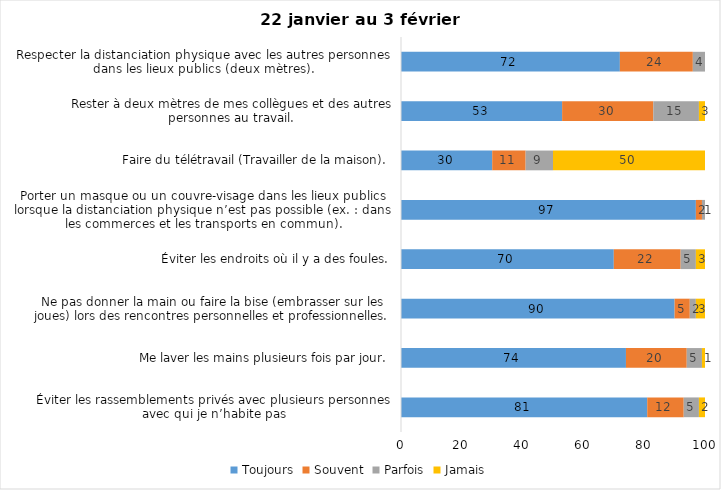
| Category | Toujours | Souvent | Parfois | Jamais |
|---|---|---|---|---|
| Éviter les rassemblements privés avec plusieurs personnes avec qui je n’habite pas | 81 | 12 | 5 | 2 |
| Me laver les mains plusieurs fois par jour. | 74 | 20 | 5 | 1 |
| Ne pas donner la main ou faire la bise (embrasser sur les joues) lors des rencontres personnelles et professionnelles. | 90 | 5 | 2 | 3 |
| Éviter les endroits où il y a des foules. | 70 | 22 | 5 | 3 |
| Porter un masque ou un couvre-visage dans les lieux publics lorsque la distanciation physique n’est pas possible (ex. : dans les commerces et les transports en commun). | 97 | 2 | 1 | 0 |
| Faire du télétravail (Travailler de la maison). | 30 | 11 | 9 | 50 |
| Rester à deux mètres de mes collègues et des autres personnes au travail. | 53 | 30 | 15 | 3 |
| Respecter la distanciation physique avec les autres personnes dans les lieux publics (deux mètres). | 72 | 24 | 4 | 0 |